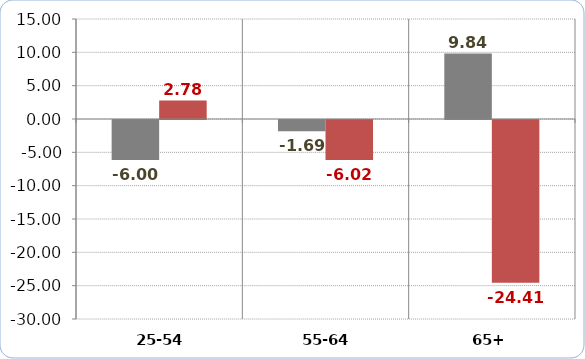
| Category | Real Income (07-15 percentage change) | People in Relative Poverty (07-15 percentage change) |
|---|---|---|
| 25-54 | -6.002 | 2.778 |
| 55-64 | -1.689 | -6.015 |
| 65+ | 9.842 | -24.411 |